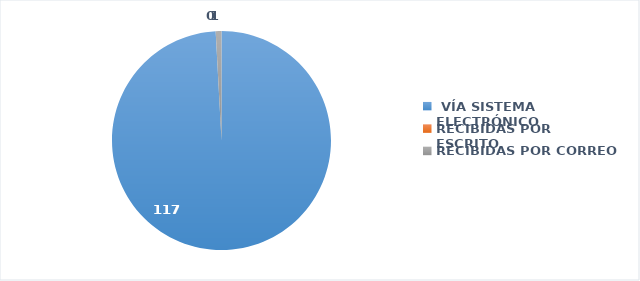
| Category | SOLICITUDES RECIBIDAS |
|---|---|
|  VÍA SISTEMA ELECTRÓNICO | 117 |
| RECIBIDAS POR ESCRITO | 0 |
| RECIBIDAS POR CORREO | 1 |